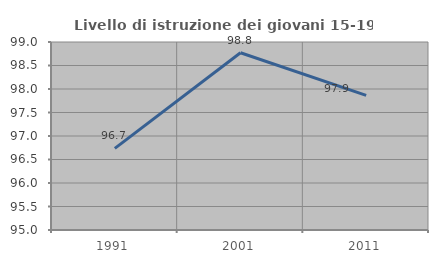
| Category | Livello di istruzione dei giovani 15-19 anni |
|---|---|
| 1991.0 | 96.736 |
| 2001.0 | 98.77 |
| 2011.0 | 97.863 |